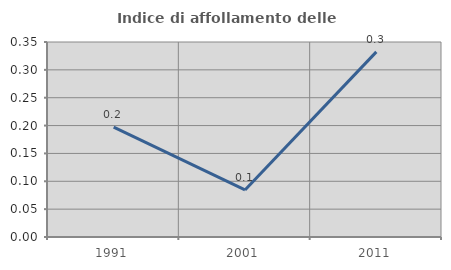
| Category | Indice di affollamento delle abitazioni  |
|---|---|
| 1991.0 | 0.197 |
| 2001.0 | 0.084 |
| 2011.0 | 0.332 |